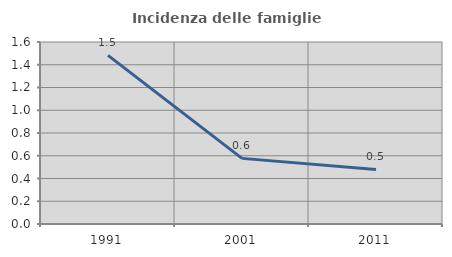
| Category | Incidenza delle famiglie numerose |
|---|---|
| 1991.0 | 1.482 |
| 2001.0 | 0.577 |
| 2011.0 | 0.48 |